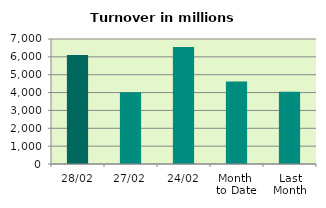
| Category | Series 0 |
|---|---|
| 28/02 | 6099.445 |
| 27/02 | 4012.546 |
| 24/02 | 6547.126 |
| Month 
to Date | 4623.097 |
| Last
Month | 4043.095 |